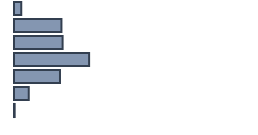
| Category | Percentatge |
|---|---|
| 0 | 3.071 |
| 1 | 19.764 |
| 2 | 20.252 |
| 3 | 31.297 |
| 4 | 19.16 |
| 5 | 6.177 |
| 6 | 0.279 |